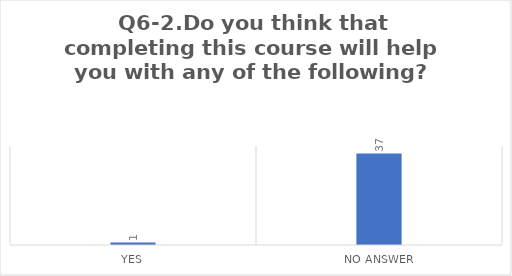
| Category | Q6-2.Do you think that completing this course will help you with any of the following?


Find a better job |
|---|---|
| Yes | 1 |
| No Answer | 37 |